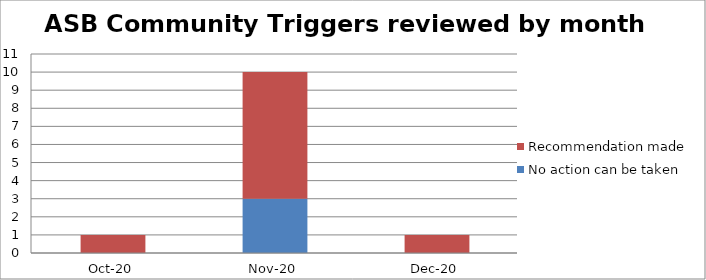
| Category | No action can be taken | Recommendation made |
|---|---|---|
| 2020-10-01 | 0 | 1 |
| 2020-11-01 | 3 | 7 |
| 2020-12-01 | 0 | 1 |